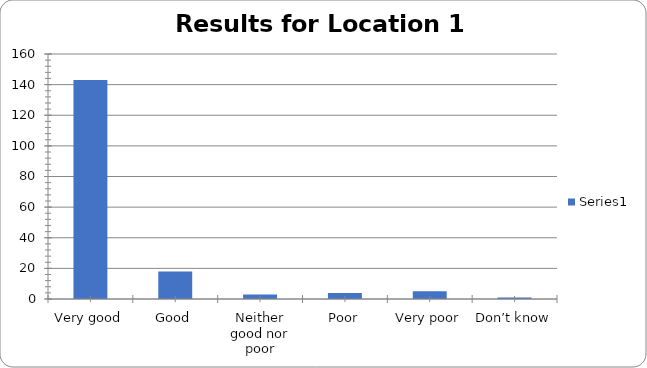
| Category | Series 0 |
|---|---|
| Very good | 143 |
| Good | 18 |
| Neither good nor poor | 3 |
| Poor | 4 |
| Very poor | 5 |
| Don’t know | 1 |